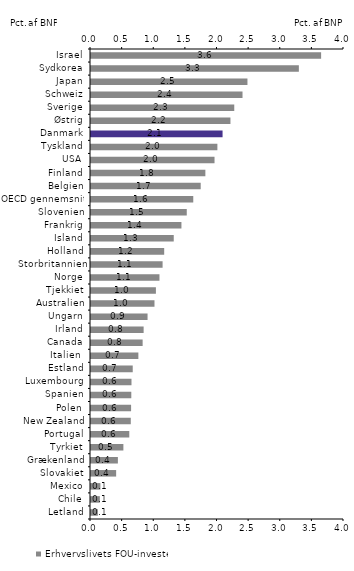
| Category | Erhvervslivets FOU-investeringer |
|---|---|
| Letland | 0.108 |
| Chile | 0.14 |
| Mexico | 0.149 |
| Slovakiet | 0.398 |
| Grækenland | 0.425 |
| Tyrkiet | 0.512 |
| Portugal | 0.606 |
| New Zealand | 0.629 |
| Polen | 0.634 |
| Spanien | 0.637 |
| Luxembourg | 0.64 |
| Estland | 0.66 |
| Italien  | 0.749 |
| Canada | 0.817 |
| Irland | 0.832 |
| Ungarn | 0.894 |
| Australien | 1.004 |
| Tjekkiet | 1.026 |
| Norge | 1.083 |
| Storbritannien | 1.132 |
| Holland | 1.157 |
| Island | 1.308 |
| Frankrig | 1.43 |
| Slovenien | 1.514 |
| OECD gennemsnit | 1.617 |
| Belgien | 1.735 |
| Finland | 1.808 |
| USA | 1.953 |
| Tyskland | 1.998 |
| Danmark | 2.08 |
| Østrig | 2.205 |
| Sverige | 2.265 |
| Schweiz | 2.395 |
| Japan | 2.473 |
| Sydkorea | 3.286 |
| Israel | 3.638 |